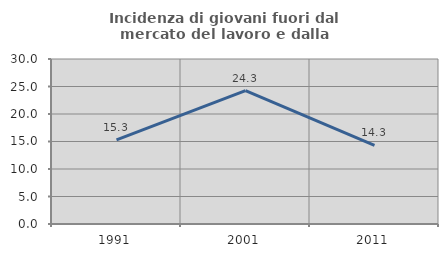
| Category | Incidenza di giovani fuori dal mercato del lavoro e dalla formazione  |
|---|---|
| 1991.0 | 15.306 |
| 2001.0 | 24.254 |
| 2011.0 | 14.286 |